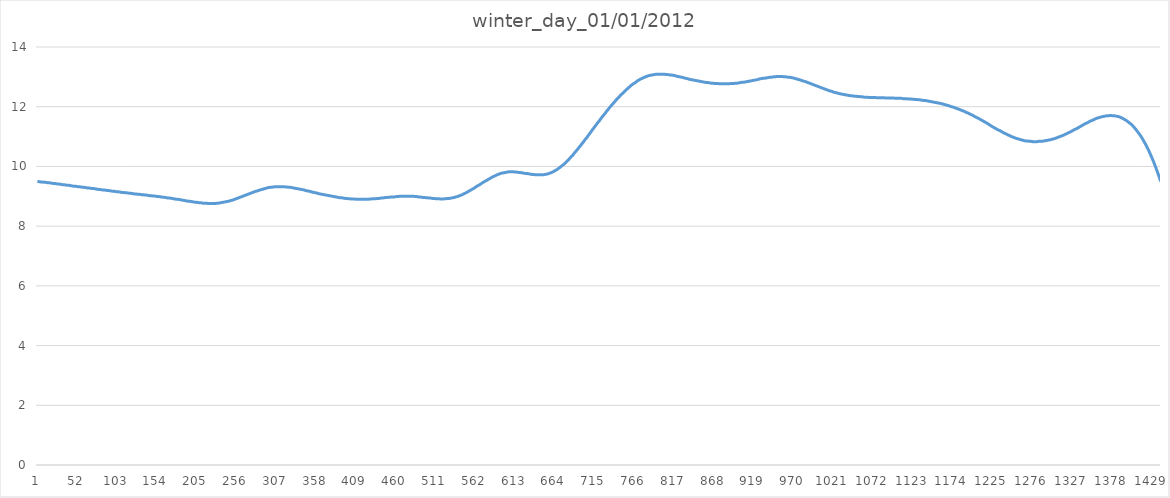
| Category | winter_day_01/01/2012 |
|---|---|
| 0 | 9.5 |
| 1 | 9.49 |
| 2 | 9.49 |
| 3 | 9.49 |
| 4 | 9.48 |
| 5 | 9.48 |
| 6 | 9.48 |
| 7 | 9.48 |
| 8 | 9.47 |
| 9 | 9.47 |
| 10 | 9.47 |
| 11 | 9.46 |
| 12 | 9.46 |
| 13 | 9.46 |
| 14 | 9.45 |
| 15 | 9.45 |
| 16 | 9.45 |
| 17 | 9.44 |
| 18 | 9.44 |
| 19 | 9.44 |
| 20 | 9.43 |
| 21 | 9.43 |
| 22 | 9.43 |
| 23 | 9.42 |
| 24 | 9.42 |
| 25 | 9.42 |
| 26 | 9.41 |
| 27 | 9.41 |
| 28 | 9.41 |
| 29 | 9.4 |
| 30 | 9.4 |
| 31 | 9.4 |
| 32 | 9.39 |
| 33 | 9.39 |
| 34 | 9.39 |
| 35 | 9.38 |
| 36 | 9.38 |
| 37 | 9.38 |
| 38 | 9.37 |
| 39 | 9.37 |
| 40 | 9.37 |
| 41 | 9.36 |
| 42 | 9.36 |
| 43 | 9.36 |
| 44 | 9.35 |
| 45 | 9.35 |
| 46 | 9.34 |
| 47 | 9.34 |
| 48 | 9.34 |
| 49 | 9.33 |
| 50 | 9.33 |
| 51 | 9.33 |
| 52 | 9.32 |
| 53 | 9.32 |
| 54 | 9.32 |
| 55 | 9.31 |
| 56 | 9.31 |
| 57 | 9.31 |
| 58 | 9.3 |
| 59 | 9.3 |
| 60 | 9.3 |
| 61 | 9.29 |
| 62 | 9.29 |
| 63 | 9.29 |
| 64 | 9.28 |
| 65 | 9.28 |
| 66 | 9.28 |
| 67 | 9.27 |
| 68 | 9.27 |
| 69 | 9.27 |
| 70 | 9.26 |
| 71 | 9.26 |
| 72 | 9.26 |
| 73 | 9.25 |
| 74 | 9.25 |
| 75 | 9.24 |
| 76 | 9.24 |
| 77 | 9.24 |
| 78 | 9.23 |
| 79 | 9.23 |
| 80 | 9.23 |
| 81 | 9.22 |
| 82 | 9.22 |
| 83 | 9.22 |
| 84 | 9.21 |
| 85 | 9.21 |
| 86 | 9.21 |
| 87 | 9.2 |
| 88 | 9.2 |
| 89 | 9.2 |
| 90 | 9.19 |
| 91 | 9.19 |
| 92 | 9.19 |
| 93 | 9.18 |
| 94 | 9.18 |
| 95 | 9.18 |
| 96 | 9.17 |
| 97 | 9.17 |
| 98 | 9.17 |
| 99 | 9.16 |
| 100 | 9.16 |
| 101 | 9.16 |
| 102 | 9.15 |
| 103 | 9.15 |
| 104 | 9.15 |
| 105 | 9.14 |
| 106 | 9.14 |
| 107 | 9.14 |
| 108 | 9.13 |
| 109 | 9.13 |
| 110 | 9.13 |
| 111 | 9.12 |
| 112 | 9.12 |
| 113 | 9.12 |
| 114 | 9.12 |
| 115 | 9.11 |
| 116 | 9.11 |
| 117 | 9.11 |
| 118 | 9.1 |
| 119 | 9.1 |
| 120 | 9.1 |
| 121 | 9.09 |
| 122 | 9.09 |
| 123 | 9.09 |
| 124 | 9.08 |
| 125 | 9.08 |
| 126 | 9.08 |
| 127 | 9.08 |
| 128 | 9.07 |
| 129 | 9.07 |
| 130 | 9.07 |
| 131 | 9.06 |
| 132 | 9.06 |
| 133 | 9.06 |
| 134 | 9.05 |
| 135 | 9.05 |
| 136 | 9.05 |
| 137 | 9.05 |
| 138 | 9.04 |
| 139 | 9.04 |
| 140 | 9.04 |
| 141 | 9.03 |
| 142 | 9.03 |
| 143 | 9.03 |
| 144 | 9.02 |
| 145 | 9.02 |
| 146 | 9.02 |
| 147 | 9.02 |
| 148 | 9.01 |
| 149 | 9.01 |
| 150 | 9.01 |
| 151 | 9 |
| 152 | 9 |
| 153 | 9 |
| 154 | 8.99 |
| 155 | 8.99 |
| 156 | 8.99 |
| 157 | 8.98 |
| 158 | 8.98 |
| 159 | 8.98 |
| 160 | 8.97 |
| 161 | 8.97 |
| 162 | 8.97 |
| 163 | 8.96 |
| 164 | 8.96 |
| 165 | 8.95 |
| 166 | 8.95 |
| 167 | 8.95 |
| 168 | 8.94 |
| 169 | 8.94 |
| 170 | 8.94 |
| 171 | 8.93 |
| 172 | 8.93 |
| 173 | 8.92 |
| 174 | 8.92 |
| 175 | 8.92 |
| 176 | 8.91 |
| 177 | 8.91 |
| 178 | 8.9 |
| 179 | 8.9 |
| 180 | 8.9 |
| 181 | 8.89 |
| 182 | 8.89 |
| 183 | 8.88 |
| 184 | 8.88 |
| 185 | 8.87 |
| 186 | 8.87 |
| 187 | 8.86 |
| 188 | 8.86 |
| 189 | 8.86 |
| 190 | 8.85 |
| 191 | 8.85 |
| 192 | 8.84 |
| 193 | 8.84 |
| 194 | 8.83 |
| 195 | 8.83 |
| 196 | 8.83 |
| 197 | 8.82 |
| 198 | 8.82 |
| 199 | 8.81 |
| 200 | 8.81 |
| 201 | 8.81 |
| 202 | 8.8 |
| 203 | 8.8 |
| 204 | 8.8 |
| 205 | 8.79 |
| 206 | 8.79 |
| 207 | 8.79 |
| 208 | 8.78 |
| 209 | 8.78 |
| 210 | 8.78 |
| 211 | 8.78 |
| 212 | 8.77 |
| 213 | 8.77 |
| 214 | 8.77 |
| 215 | 8.77 |
| 216 | 8.77 |
| 217 | 8.76 |
| 218 | 8.76 |
| 219 | 8.76 |
| 220 | 8.76 |
| 221 | 8.76 |
| 222 | 8.76 |
| 223 | 8.76 |
| 224 | 8.76 |
| 225 | 8.76 |
| 226 | 8.76 |
| 227 | 8.76 |
| 228 | 8.76 |
| 229 | 8.77 |
| 230 | 8.77 |
| 231 | 8.77 |
| 232 | 8.77 |
| 233 | 8.78 |
| 234 | 8.78 |
| 235 | 8.78 |
| 236 | 8.79 |
| 237 | 8.79 |
| 238 | 8.8 |
| 239 | 8.8 |
| 240 | 8.81 |
| 241 | 8.81 |
| 242 | 8.82 |
| 243 | 8.82 |
| 244 | 8.83 |
| 245 | 8.84 |
| 246 | 8.84 |
| 247 | 8.85 |
| 248 | 8.86 |
| 249 | 8.87 |
| 250 | 8.87 |
| 251 | 8.88 |
| 252 | 8.89 |
| 253 | 8.9 |
| 254 | 8.91 |
| 255 | 8.92 |
| 256 | 8.93 |
| 257 | 8.94 |
| 258 | 8.95 |
| 259 | 8.96 |
| 260 | 8.97 |
| 261 | 8.98 |
| 262 | 8.99 |
| 263 | 9 |
| 264 | 9.01 |
| 265 | 9.02 |
| 266 | 9.03 |
| 267 | 9.04 |
| 268 | 9.05 |
| 269 | 9.06 |
| 270 | 9.07 |
| 271 | 9.08 |
| 272 | 9.09 |
| 273 | 9.1 |
| 274 | 9.11 |
| 275 | 9.12 |
| 276 | 9.13 |
| 277 | 9.14 |
| 278 | 9.15 |
| 279 | 9.16 |
| 280 | 9.17 |
| 281 | 9.18 |
| 282 | 9.18 |
| 283 | 9.19 |
| 284 | 9.2 |
| 285 | 9.21 |
| 286 | 9.22 |
| 287 | 9.23 |
| 288 | 9.23 |
| 289 | 9.24 |
| 290 | 9.25 |
| 291 | 9.26 |
| 292 | 9.26 |
| 293 | 9.27 |
| 294 | 9.28 |
| 295 | 9.28 |
| 296 | 9.29 |
| 297 | 9.29 |
| 298 | 9.3 |
| 299 | 9.3 |
| 300 | 9.3 |
| 301 | 9.31 |
| 302 | 9.31 |
| 303 | 9.31 |
| 304 | 9.32 |
| 305 | 9.32 |
| 306 | 9.32 |
| 307 | 9.32 |
| 308 | 9.32 |
| 309 | 9.32 |
| 310 | 9.32 |
| 311 | 9.32 |
| 312 | 9.32 |
| 313 | 9.32 |
| 314 | 9.32 |
| 315 | 9.32 |
| 316 | 9.32 |
| 317 | 9.32 |
| 318 | 9.31 |
| 319 | 9.31 |
| 320 | 9.31 |
| 321 | 9.31 |
| 322 | 9.3 |
| 323 | 9.3 |
| 324 | 9.3 |
| 325 | 9.29 |
| 326 | 9.29 |
| 327 | 9.28 |
| 328 | 9.28 |
| 329 | 9.28 |
| 330 | 9.27 |
| 331 | 9.27 |
| 332 | 9.26 |
| 333 | 9.26 |
| 334 | 9.25 |
| 335 | 9.25 |
| 336 | 9.24 |
| 337 | 9.24 |
| 338 | 9.23 |
| 339 | 9.22 |
| 340 | 9.22 |
| 341 | 9.21 |
| 342 | 9.21 |
| 343 | 9.2 |
| 344 | 9.19 |
| 345 | 9.19 |
| 346 | 9.18 |
| 347 | 9.18 |
| 348 | 9.17 |
| 349 | 9.16 |
| 350 | 9.16 |
| 351 | 9.15 |
| 352 | 9.14 |
| 353 | 9.14 |
| 354 | 9.13 |
| 355 | 9.12 |
| 356 | 9.12 |
| 357 | 9.11 |
| 358 | 9.11 |
| 359 | 9.1 |
| 360 | 9.09 |
| 361 | 9.09 |
| 362 | 9.08 |
| 363 | 9.08 |
| 364 | 9.07 |
| 365 | 9.06 |
| 366 | 9.06 |
| 367 | 9.05 |
| 368 | 9.05 |
| 369 | 9.04 |
| 370 | 9.04 |
| 371 | 9.03 |
| 372 | 9.03 |
| 373 | 9.02 |
| 374 | 9.02 |
| 375 | 9.01 |
| 376 | 9.01 |
| 377 | 9 |
| 378 | 9 |
| 379 | 8.99 |
| 380 | 8.99 |
| 381 | 8.98 |
| 382 | 8.98 |
| 383 | 8.97 |
| 384 | 8.97 |
| 385 | 8.96 |
| 386 | 8.96 |
| 387 | 8.96 |
| 388 | 8.95 |
| 389 | 8.95 |
| 390 | 8.95 |
| 391 | 8.94 |
| 392 | 8.94 |
| 393 | 8.94 |
| 394 | 8.93 |
| 395 | 8.93 |
| 396 | 8.93 |
| 397 | 8.92 |
| 398 | 8.92 |
| 399 | 8.92 |
| 400 | 8.92 |
| 401 | 8.91 |
| 402 | 8.91 |
| 403 | 8.91 |
| 404 | 8.91 |
| 405 | 8.91 |
| 406 | 8.91 |
| 407 | 8.9 |
| 408 | 8.9 |
| 409 | 8.9 |
| 410 | 8.9 |
| 411 | 8.9 |
| 412 | 8.9 |
| 413 | 8.9 |
| 414 | 8.9 |
| 415 | 8.9 |
| 416 | 8.9 |
| 417 | 8.9 |
| 418 | 8.9 |
| 419 | 8.9 |
| 420 | 8.9 |
| 421 | 8.9 |
| 422 | 8.9 |
| 423 | 8.9 |
| 424 | 8.9 |
| 425 | 8.91 |
| 426 | 8.91 |
| 427 | 8.91 |
| 428 | 8.91 |
| 429 | 8.91 |
| 430 | 8.92 |
| 431 | 8.92 |
| 432 | 8.92 |
| 433 | 8.92 |
| 434 | 8.92 |
| 435 | 8.93 |
| 436 | 8.93 |
| 437 | 8.93 |
| 438 | 8.93 |
| 439 | 8.94 |
| 440 | 8.94 |
| 441 | 8.94 |
| 442 | 8.94 |
| 443 | 8.95 |
| 444 | 8.95 |
| 445 | 8.95 |
| 446 | 8.96 |
| 447 | 8.96 |
| 448 | 8.96 |
| 449 | 8.96 |
| 450 | 8.97 |
| 451 | 8.97 |
| 452 | 8.97 |
| 453 | 8.97 |
| 454 | 8.98 |
| 455 | 8.98 |
| 456 | 8.98 |
| 457 | 8.98 |
| 458 | 8.98 |
| 459 | 8.99 |
| 460 | 8.99 |
| 461 | 8.99 |
| 462 | 8.99 |
| 463 | 8.99 |
| 464 | 9 |
| 465 | 9 |
| 466 | 9 |
| 467 | 9 |
| 468 | 9 |
| 469 | 9 |
| 470 | 9 |
| 471 | 9 |
| 472 | 9 |
| 473 | 9 |
| 474 | 9 |
| 475 | 9 |
| 476 | 9 |
| 477 | 9 |
| 478 | 9 |
| 479 | 9 |
| 480 | 9 |
| 481 | 9 |
| 482 | 9 |
| 483 | 8.99 |
| 484 | 8.99 |
| 485 | 8.99 |
| 486 | 8.99 |
| 487 | 8.98 |
| 488 | 8.98 |
| 489 | 8.98 |
| 490 | 8.98 |
| 491 | 8.97 |
| 492 | 8.97 |
| 493 | 8.97 |
| 494 | 8.96 |
| 495 | 8.96 |
| 496 | 8.96 |
| 497 | 8.96 |
| 498 | 8.95 |
| 499 | 8.95 |
| 500 | 8.95 |
| 501 | 8.94 |
| 502 | 8.94 |
| 503 | 8.94 |
| 504 | 8.94 |
| 505 | 8.93 |
| 506 | 8.93 |
| 507 | 8.93 |
| 508 | 8.93 |
| 509 | 8.92 |
| 510 | 8.92 |
| 511 | 8.92 |
| 512 | 8.92 |
| 513 | 8.92 |
| 514 | 8.92 |
| 515 | 8.91 |
| 516 | 8.91 |
| 517 | 8.91 |
| 518 | 8.91 |
| 519 | 8.91 |
| 520 | 8.91 |
| 521 | 8.92 |
| 522 | 8.92 |
| 523 | 8.92 |
| 524 | 8.92 |
| 525 | 8.92 |
| 526 | 8.93 |
| 527 | 8.93 |
| 528 | 8.93 |
| 529 | 8.94 |
| 530 | 8.94 |
| 531 | 8.94 |
| 532 | 8.95 |
| 533 | 8.96 |
| 534 | 8.96 |
| 535 | 8.97 |
| 536 | 8.98 |
| 537 | 8.98 |
| 538 | 8.99 |
| 539 | 9 |
| 540 | 9.01 |
| 541 | 9.02 |
| 542 | 9.03 |
| 543 | 9.04 |
| 544 | 9.05 |
| 545 | 9.06 |
| 546 | 9.08 |
| 547 | 9.09 |
| 548 | 9.1 |
| 549 | 9.12 |
| 550 | 9.13 |
| 551 | 9.14 |
| 552 | 9.16 |
| 553 | 9.17 |
| 554 | 9.19 |
| 555 | 9.2 |
| 556 | 9.22 |
| 557 | 9.23 |
| 558 | 9.25 |
| 559 | 9.27 |
| 560 | 9.28 |
| 561 | 9.3 |
| 562 | 9.32 |
| 563 | 9.33 |
| 564 | 9.35 |
| 565 | 9.36 |
| 566 | 9.38 |
| 567 | 9.4 |
| 568 | 9.41 |
| 569 | 9.43 |
| 570 | 9.45 |
| 571 | 9.46 |
| 572 | 9.48 |
| 573 | 9.5 |
| 574 | 9.51 |
| 575 | 9.53 |
| 576 | 9.54 |
| 577 | 9.56 |
| 578 | 9.57 |
| 579 | 9.59 |
| 580 | 9.6 |
| 581 | 9.62 |
| 582 | 9.63 |
| 583 | 9.65 |
| 584 | 9.66 |
| 585 | 9.67 |
| 586 | 9.68 |
| 587 | 9.7 |
| 588 | 9.71 |
| 589 | 9.72 |
| 590 | 9.73 |
| 591 | 9.74 |
| 592 | 9.75 |
| 593 | 9.76 |
| 594 | 9.77 |
| 595 | 9.78 |
| 596 | 9.78 |
| 597 | 9.79 |
| 598 | 9.79 |
| 599 | 9.8 |
| 600 | 9.8 |
| 601 | 9.81 |
| 602 | 9.81 |
| 603 | 9.81 |
| 604 | 9.82 |
| 605 | 9.82 |
| 606 | 9.82 |
| 607 | 9.82 |
| 608 | 9.82 |
| 609 | 9.82 |
| 610 | 9.82 |
| 611 | 9.82 |
| 612 | 9.81 |
| 613 | 9.81 |
| 614 | 9.81 |
| 615 | 9.81 |
| 616 | 9.8 |
| 617 | 9.8 |
| 618 | 9.8 |
| 619 | 9.79 |
| 620 | 9.79 |
| 621 | 9.78 |
| 622 | 9.78 |
| 623 | 9.78 |
| 624 | 9.77 |
| 625 | 9.77 |
| 626 | 9.76 |
| 627 | 9.76 |
| 628 | 9.76 |
| 629 | 9.75 |
| 630 | 9.75 |
| 631 | 9.74 |
| 632 | 9.74 |
| 633 | 9.74 |
| 634 | 9.73 |
| 635 | 9.73 |
| 636 | 9.73 |
| 637 | 9.72 |
| 638 | 9.72 |
| 639 | 9.72 |
| 640 | 9.72 |
| 641 | 9.72 |
| 642 | 9.72 |
| 643 | 9.72 |
| 644 | 9.72 |
| 645 | 9.72 |
| 646 | 9.72 |
| 647 | 9.72 |
| 648 | 9.72 |
| 649 | 9.73 |
| 650 | 9.73 |
| 651 | 9.74 |
| 652 | 9.74 |
| 653 | 9.75 |
| 654 | 9.75 |
| 655 | 9.76 |
| 656 | 9.77 |
| 657 | 9.78 |
| 658 | 9.79 |
| 659 | 9.8 |
| 660 | 9.81 |
| 661 | 9.82 |
| 662 | 9.84 |
| 663 | 9.85 |
| 664 | 9.87 |
| 665 | 9.88 |
| 666 | 9.9 |
| 667 | 9.92 |
| 668 | 9.94 |
| 669 | 9.96 |
| 670 | 9.98 |
| 671 | 10 |
| 672 | 10.02 |
| 673 | 10.04 |
| 674 | 10.06 |
| 675 | 10.09 |
| 676 | 10.11 |
| 677 | 10.14 |
| 678 | 10.16 |
| 679 | 10.19 |
| 680 | 10.21 |
| 681 | 10.24 |
| 682 | 10.27 |
| 683 | 10.3 |
| 684 | 10.33 |
| 685 | 10.36 |
| 686 | 10.38 |
| 687 | 10.41 |
| 688 | 10.45 |
| 689 | 10.48 |
| 690 | 10.51 |
| 691 | 10.54 |
| 692 | 10.57 |
| 693 | 10.6 |
| 694 | 10.64 |
| 695 | 10.67 |
| 696 | 10.7 |
| 697 | 10.74 |
| 698 | 10.77 |
| 699 | 10.8 |
| 700 | 10.84 |
| 701 | 10.87 |
| 702 | 10.91 |
| 703 | 10.94 |
| 704 | 10.97 |
| 705 | 11.01 |
| 706 | 11.04 |
| 707 | 11.08 |
| 708 | 11.11 |
| 709 | 11.15 |
| 710 | 11.19 |
| 711 | 11.22 |
| 712 | 11.26 |
| 713 | 11.29 |
| 714 | 11.33 |
| 715 | 11.36 |
| 716 | 11.4 |
| 717 | 11.43 |
| 718 | 11.47 |
| 719 | 11.5 |
| 720 | 11.53 |
| 721 | 11.57 |
| 722 | 11.6 |
| 723 | 11.64 |
| 724 | 11.67 |
| 725 | 11.7 |
| 726 | 11.74 |
| 727 | 11.77 |
| 728 | 11.8 |
| 729 | 11.84 |
| 730 | 11.87 |
| 731 | 11.9 |
| 732 | 11.93 |
| 733 | 11.97 |
| 734 | 12 |
| 735 | 12.03 |
| 736 | 12.06 |
| 737 | 12.09 |
| 738 | 12.12 |
| 739 | 12.15 |
| 740 | 12.18 |
| 741 | 12.21 |
| 742 | 12.24 |
| 743 | 12.27 |
| 744 | 12.3 |
| 745 | 12.32 |
| 746 | 12.35 |
| 747 | 12.38 |
| 748 | 12.41 |
| 749 | 12.43 |
| 750 | 12.46 |
| 751 | 12.48 |
| 752 | 12.51 |
| 753 | 12.53 |
| 754 | 12.56 |
| 755 | 12.58 |
| 756 | 12.61 |
| 757 | 12.63 |
| 758 | 12.65 |
| 759 | 12.67 |
| 760 | 12.69 |
| 761 | 12.72 |
| 762 | 12.74 |
| 763 | 12.76 |
| 764 | 12.78 |
| 765 | 12.79 |
| 766 | 12.81 |
| 767 | 12.83 |
| 768 | 12.85 |
| 769 | 12.87 |
| 770 | 12.88 |
| 771 | 12.9 |
| 772 | 12.91 |
| 773 | 12.93 |
| 774 | 12.94 |
| 775 | 12.95 |
| 776 | 12.97 |
| 777 | 12.98 |
| 778 | 12.99 |
| 779 | 13 |
| 780 | 13.01 |
| 781 | 13.02 |
| 782 | 13.03 |
| 783 | 13.04 |
| 784 | 13.04 |
| 785 | 13.05 |
| 786 | 13.06 |
| 787 | 13.06 |
| 788 | 13.07 |
| 789 | 13.07 |
| 790 | 13.08 |
| 791 | 13.08 |
| 792 | 13.08 |
| 793 | 13.09 |
| 794 | 13.09 |
| 795 | 13.09 |
| 796 | 13.09 |
| 797 | 13.09 |
| 798 | 13.09 |
| 799 | 13.09 |
| 800 | 13.09 |
| 801 | 13.09 |
| 802 | 13.09 |
| 803 | 13.09 |
| 804 | 13.09 |
| 805 | 13.08 |
| 806 | 13.08 |
| 807 | 13.08 |
| 808 | 13.08 |
| 809 | 13.07 |
| 810 | 13.07 |
| 811 | 13.06 |
| 812 | 13.06 |
| 813 | 13.06 |
| 814 | 13.05 |
| 815 | 13.05 |
| 816 | 13.04 |
| 817 | 13.04 |
| 818 | 13.03 |
| 819 | 13.02 |
| 820 | 13.02 |
| 821 | 13.01 |
| 822 | 13.01 |
| 823 | 13 |
| 824 | 12.99 |
| 825 | 12.99 |
| 826 | 12.98 |
| 827 | 12.98 |
| 828 | 12.97 |
| 829 | 12.96 |
| 830 | 12.96 |
| 831 | 12.95 |
| 832 | 12.94 |
| 833 | 12.94 |
| 834 | 12.93 |
| 835 | 12.92 |
| 836 | 12.92 |
| 837 | 12.91 |
| 838 | 12.91 |
| 839 | 12.9 |
| 840 | 12.89 |
| 841 | 12.89 |
| 842 | 12.88 |
| 843 | 12.88 |
| 844 | 12.87 |
| 845 | 12.87 |
| 846 | 12.86 |
| 847 | 12.86 |
| 848 | 12.85 |
| 849 | 12.85 |
| 850 | 12.84 |
| 851 | 12.84 |
| 852 | 12.83 |
| 853 | 12.83 |
| 854 | 12.82 |
| 855 | 12.82 |
| 856 | 12.82 |
| 857 | 12.81 |
| 858 | 12.81 |
| 859 | 12.81 |
| 860 | 12.8 |
| 861 | 12.8 |
| 862 | 12.8 |
| 863 | 12.79 |
| 864 | 12.79 |
| 865 | 12.79 |
| 866 | 12.79 |
| 867 | 12.78 |
| 868 | 12.78 |
| 869 | 12.78 |
| 870 | 12.78 |
| 871 | 12.78 |
| 872 | 12.78 |
| 873 | 12.77 |
| 874 | 12.77 |
| 875 | 12.77 |
| 876 | 12.77 |
| 877 | 12.77 |
| 878 | 12.77 |
| 879 | 12.77 |
| 880 | 12.77 |
| 881 | 12.77 |
| 882 | 12.77 |
| 883 | 12.77 |
| 884 | 12.77 |
| 885 | 12.77 |
| 886 | 12.77 |
| 887 | 12.77 |
| 888 | 12.77 |
| 889 | 12.78 |
| 890 | 12.78 |
| 891 | 12.78 |
| 892 | 12.78 |
| 893 | 12.78 |
| 894 | 12.79 |
| 895 | 12.79 |
| 896 | 12.79 |
| 897 | 12.79 |
| 898 | 12.8 |
| 899 | 12.8 |
| 900 | 12.8 |
| 901 | 12.81 |
| 902 | 12.81 |
| 903 | 12.82 |
| 904 | 12.82 |
| 905 | 12.82 |
| 906 | 12.83 |
| 907 | 12.83 |
| 908 | 12.84 |
| 909 | 12.84 |
| 910 | 12.85 |
| 911 | 12.85 |
| 912 | 12.86 |
| 913 | 12.86 |
| 914 | 12.87 |
| 915 | 12.87 |
| 916 | 12.88 |
| 917 | 12.88 |
| 918 | 12.89 |
| 919 | 12.89 |
| 920 | 12.9 |
| 921 | 12.9 |
| 922 | 12.91 |
| 923 | 12.91 |
| 924 | 12.92 |
| 925 | 12.93 |
| 926 | 12.93 |
| 927 | 12.94 |
| 928 | 12.94 |
| 929 | 12.95 |
| 930 | 12.95 |
| 931 | 12.95 |
| 932 | 12.96 |
| 933 | 12.96 |
| 934 | 12.97 |
| 935 | 12.97 |
| 936 | 12.98 |
| 937 | 12.98 |
| 938 | 12.98 |
| 939 | 12.99 |
| 940 | 12.99 |
| 941 | 12.99 |
| 942 | 13 |
| 943 | 13 |
| 944 | 13 |
| 945 | 13 |
| 946 | 13 |
| 947 | 13.01 |
| 948 | 13.01 |
| 949 | 13.01 |
| 950 | 13.01 |
| 951 | 13.01 |
| 952 | 13.01 |
| 953 | 13.01 |
| 954 | 13.01 |
| 955 | 13.01 |
| 956 | 13.01 |
| 957 | 13 |
| 958 | 13 |
| 959 | 13 |
| 960 | 13 |
| 961 | 12.99 |
| 962 | 12.99 |
| 963 | 12.99 |
| 964 | 12.98 |
| 965 | 12.98 |
| 966 | 12.97 |
| 967 | 12.97 |
| 968 | 12.96 |
| 969 | 12.96 |
| 970 | 12.95 |
| 971 | 12.94 |
| 972 | 12.94 |
| 973 | 12.93 |
| 974 | 12.92 |
| 975 | 12.91 |
| 976 | 12.91 |
| 977 | 12.9 |
| 978 | 12.89 |
| 979 | 12.88 |
| 980 | 12.87 |
| 981 | 12.86 |
| 982 | 12.86 |
| 983 | 12.85 |
| 984 | 12.84 |
| 985 | 12.83 |
| 986 | 12.82 |
| 987 | 12.81 |
| 988 | 12.8 |
| 989 | 12.79 |
| 990 | 12.78 |
| 991 | 12.77 |
| 992 | 12.76 |
| 993 | 12.75 |
| 994 | 12.74 |
| 995 | 12.73 |
| 996 | 12.72 |
| 997 | 12.71 |
| 998 | 12.7 |
| 999 | 12.69 |
| 1000 | 12.68 |
| 1001 | 12.67 |
| 1002 | 12.66 |
| 1003 | 12.65 |
| 1004 | 12.64 |
| 1005 | 12.63 |
| 1006 | 12.62 |
| 1007 | 12.61 |
| 1008 | 12.6 |
| 1009 | 12.59 |
| 1010 | 12.58 |
| 1011 | 12.57 |
| 1012 | 12.56 |
| 1013 | 12.55 |
| 1014 | 12.54 |
| 1015 | 12.53 |
| 1016 | 12.52 |
| 1017 | 12.52 |
| 1018 | 12.51 |
| 1019 | 12.5 |
| 1020 | 12.49 |
| 1021 | 12.48 |
| 1022 | 12.48 |
| 1023 | 12.47 |
| 1024 | 12.46 |
| 1025 | 12.46 |
| 1026 | 12.45 |
| 1027 | 12.44 |
| 1028 | 12.44 |
| 1029 | 12.43 |
| 1030 | 12.43 |
| 1031 | 12.42 |
| 1032 | 12.41 |
| 1033 | 12.41 |
| 1034 | 12.4 |
| 1035 | 12.4 |
| 1036 | 12.39 |
| 1037 | 12.39 |
| 1038 | 12.39 |
| 1039 | 12.38 |
| 1040 | 12.38 |
| 1041 | 12.37 |
| 1042 | 12.37 |
| 1043 | 12.37 |
| 1044 | 12.36 |
| 1045 | 12.36 |
| 1046 | 12.36 |
| 1047 | 12.35 |
| 1048 | 12.35 |
| 1049 | 12.35 |
| 1050 | 12.34 |
| 1051 | 12.34 |
| 1052 | 12.34 |
| 1053 | 12.34 |
| 1054 | 12.33 |
| 1055 | 12.33 |
| 1056 | 12.33 |
| 1057 | 12.33 |
| 1058 | 12.33 |
| 1059 | 12.32 |
| 1060 | 12.32 |
| 1061 | 12.32 |
| 1062 | 12.32 |
| 1063 | 12.32 |
| 1064 | 12.32 |
| 1065 | 12.31 |
| 1066 | 12.31 |
| 1067 | 12.31 |
| 1068 | 12.31 |
| 1069 | 12.31 |
| 1070 | 12.31 |
| 1071 | 12.31 |
| 1072 | 12.31 |
| 1073 | 12.31 |
| 1074 | 12.3 |
| 1075 | 12.3 |
| 1076 | 12.3 |
| 1077 | 12.3 |
| 1078 | 12.3 |
| 1079 | 12.3 |
| 1080 | 12.3 |
| 1081 | 12.3 |
| 1082 | 12.3 |
| 1083 | 12.3 |
| 1084 | 12.3 |
| 1085 | 12.3 |
| 1086 | 12.29 |
| 1087 | 12.29 |
| 1088 | 12.29 |
| 1089 | 12.29 |
| 1090 | 12.29 |
| 1091 | 12.29 |
| 1092 | 12.29 |
| 1093 | 12.29 |
| 1094 | 12.29 |
| 1095 | 12.29 |
| 1096 | 12.29 |
| 1097 | 12.29 |
| 1098 | 12.29 |
| 1099 | 12.28 |
| 1100 | 12.28 |
| 1101 | 12.28 |
| 1102 | 12.28 |
| 1103 | 12.28 |
| 1104 | 12.28 |
| 1105 | 12.28 |
| 1106 | 12.28 |
| 1107 | 12.28 |
| 1108 | 12.27 |
| 1109 | 12.27 |
| 1110 | 12.27 |
| 1111 | 12.27 |
| 1112 | 12.27 |
| 1113 | 12.27 |
| 1114 | 12.27 |
| 1115 | 12.26 |
| 1116 | 12.26 |
| 1117 | 12.26 |
| 1118 | 12.26 |
| 1119 | 12.26 |
| 1120 | 12.26 |
| 1121 | 12.25 |
| 1122 | 12.25 |
| 1123 | 12.25 |
| 1124 | 12.25 |
| 1125 | 12.24 |
| 1126 | 12.24 |
| 1127 | 12.24 |
| 1128 | 12.24 |
| 1129 | 12.23 |
| 1130 | 12.23 |
| 1131 | 12.23 |
| 1132 | 12.22 |
| 1133 | 12.22 |
| 1134 | 12.22 |
| 1135 | 12.21 |
| 1136 | 12.21 |
| 1137 | 12.21 |
| 1138 | 12.2 |
| 1139 | 12.2 |
| 1140 | 12.2 |
| 1141 | 12.19 |
| 1142 | 12.19 |
| 1143 | 12.18 |
| 1144 | 12.18 |
| 1145 | 12.17 |
| 1146 | 12.17 |
| 1147 | 12.16 |
| 1148 | 12.16 |
| 1149 | 12.15 |
| 1150 | 12.15 |
| 1151 | 12.14 |
| 1152 | 12.14 |
| 1153 | 12.13 |
| 1154 | 12.13 |
| 1155 | 12.12 |
| 1156 | 12.11 |
| 1157 | 12.11 |
| 1158 | 12.1 |
| 1159 | 12.1 |
| 1160 | 12.09 |
| 1161 | 12.08 |
| 1162 | 12.07 |
| 1163 | 12.07 |
| 1164 | 12.06 |
| 1165 | 12.05 |
| 1166 | 12.05 |
| 1167 | 12.04 |
| 1168 | 12.03 |
| 1169 | 12.02 |
| 1170 | 12.01 |
| 1171 | 12 |
| 1172 | 12 |
| 1173 | 11.99 |
| 1174 | 11.98 |
| 1175 | 11.97 |
| 1176 | 11.96 |
| 1177 | 11.95 |
| 1178 | 11.94 |
| 1179 | 11.93 |
| 1180 | 11.92 |
| 1181 | 11.91 |
| 1182 | 11.9 |
| 1183 | 11.89 |
| 1184 | 11.88 |
| 1185 | 11.87 |
| 1186 | 11.86 |
| 1187 | 11.85 |
| 1188 | 11.84 |
| 1189 | 11.82 |
| 1190 | 11.81 |
| 1191 | 11.8 |
| 1192 | 11.79 |
| 1193 | 11.78 |
| 1194 | 11.76 |
| 1195 | 11.75 |
| 1196 | 11.74 |
| 1197 | 11.73 |
| 1198 | 11.71 |
| 1199 | 11.7 |
| 1200 | 11.69 |
| 1201 | 11.67 |
| 1202 | 11.66 |
| 1203 | 11.64 |
| 1204 | 11.63 |
| 1205 | 11.62 |
| 1206 | 11.6 |
| 1207 | 11.59 |
| 1208 | 11.57 |
| 1209 | 11.56 |
| 1210 | 11.54 |
| 1211 | 11.53 |
| 1212 | 11.51 |
| 1213 | 11.5 |
| 1214 | 11.48 |
| 1215 | 11.47 |
| 1216 | 11.45 |
| 1217 | 11.44 |
| 1218 | 11.42 |
| 1219 | 11.41 |
| 1220 | 11.39 |
| 1221 | 11.37 |
| 1222 | 11.36 |
| 1223 | 11.34 |
| 1224 | 11.33 |
| 1225 | 11.31 |
| 1226 | 11.3 |
| 1227 | 11.28 |
| 1228 | 11.27 |
| 1229 | 11.25 |
| 1230 | 11.24 |
| 1231 | 11.22 |
| 1232 | 11.21 |
| 1233 | 11.2 |
| 1234 | 11.18 |
| 1235 | 11.17 |
| 1236 | 11.15 |
| 1237 | 11.14 |
| 1238 | 11.13 |
| 1239 | 11.11 |
| 1240 | 11.1 |
| 1241 | 11.09 |
| 1242 | 11.07 |
| 1243 | 11.06 |
| 1244 | 11.05 |
| 1245 | 11.04 |
| 1246 | 11.02 |
| 1247 | 11.01 |
| 1248 | 11 |
| 1249 | 10.99 |
| 1250 | 10.98 |
| 1251 | 10.97 |
| 1252 | 10.96 |
| 1253 | 10.95 |
| 1254 | 10.94 |
| 1255 | 10.93 |
| 1256 | 10.92 |
| 1257 | 10.92 |
| 1258 | 10.91 |
| 1259 | 10.9 |
| 1260 | 10.89 |
| 1261 | 10.89 |
| 1262 | 10.88 |
| 1263 | 10.87 |
| 1264 | 10.87 |
| 1265 | 10.86 |
| 1266 | 10.86 |
| 1267 | 10.85 |
| 1268 | 10.85 |
| 1269 | 10.85 |
| 1270 | 10.84 |
| 1271 | 10.84 |
| 1272 | 10.84 |
| 1273 | 10.84 |
| 1274 | 10.83 |
| 1275 | 10.83 |
| 1276 | 10.83 |
| 1277 | 10.83 |
| 1278 | 10.83 |
| 1279 | 10.83 |
| 1280 | 10.83 |
| 1281 | 10.83 |
| 1282 | 10.83 |
| 1283 | 10.84 |
| 1284 | 10.84 |
| 1285 | 10.84 |
| 1286 | 10.84 |
| 1287 | 10.84 |
| 1288 | 10.85 |
| 1289 | 10.85 |
| 1290 | 10.86 |
| 1291 | 10.86 |
| 1292 | 10.86 |
| 1293 | 10.87 |
| 1294 | 10.87 |
| 1295 | 10.88 |
| 1296 | 10.88 |
| 1297 | 10.89 |
| 1298 | 10.9 |
| 1299 | 10.9 |
| 1300 | 10.91 |
| 1301 | 10.92 |
| 1302 | 10.93 |
| 1303 | 10.93 |
| 1304 | 10.94 |
| 1305 | 10.95 |
| 1306 | 10.96 |
| 1307 | 10.97 |
| 1308 | 10.98 |
| 1309 | 10.99 |
| 1310 | 11 |
| 1311 | 11.01 |
| 1312 | 11.02 |
| 1313 | 11.03 |
| 1314 | 11.04 |
| 1315 | 11.05 |
| 1316 | 11.06 |
| 1317 | 11.08 |
| 1318 | 11.09 |
| 1319 | 11.1 |
| 1320 | 11.11 |
| 1321 | 11.13 |
| 1322 | 11.14 |
| 1323 | 11.15 |
| 1324 | 11.17 |
| 1325 | 11.18 |
| 1326 | 11.19 |
| 1327 | 11.21 |
| 1328 | 11.22 |
| 1329 | 11.24 |
| 1330 | 11.25 |
| 1331 | 11.26 |
| 1332 | 11.28 |
| 1333 | 11.29 |
| 1334 | 11.31 |
| 1335 | 11.32 |
| 1336 | 11.34 |
| 1337 | 11.35 |
| 1338 | 11.37 |
| 1339 | 11.38 |
| 1340 | 11.39 |
| 1341 | 11.41 |
| 1342 | 11.42 |
| 1343 | 11.44 |
| 1344 | 11.45 |
| 1345 | 11.46 |
| 1346 | 11.48 |
| 1347 | 11.49 |
| 1348 | 11.5 |
| 1349 | 11.52 |
| 1350 | 11.53 |
| 1351 | 11.54 |
| 1352 | 11.55 |
| 1353 | 11.56 |
| 1354 | 11.58 |
| 1355 | 11.59 |
| 1356 | 11.6 |
| 1357 | 11.61 |
| 1358 | 11.62 |
| 1359 | 11.63 |
| 1360 | 11.64 |
| 1361 | 11.64 |
| 1362 | 11.65 |
| 1363 | 11.66 |
| 1364 | 11.67 |
| 1365 | 11.67 |
| 1366 | 11.68 |
| 1367 | 11.68 |
| 1368 | 11.69 |
| 1369 | 11.69 |
| 1370 | 11.7 |
| 1371 | 11.7 |
| 1372 | 11.7 |
| 1373 | 11.7 |
| 1374 | 11.71 |
| 1375 | 11.71 |
| 1376 | 11.71 |
| 1377 | 11.7 |
| 1378 | 11.7 |
| 1379 | 11.7 |
| 1380 | 11.7 |
| 1381 | 11.69 |
| 1382 | 11.69 |
| 1383 | 11.68 |
| 1384 | 11.68 |
| 1385 | 11.67 |
| 1386 | 11.66 |
| 1387 | 11.65 |
| 1388 | 11.64 |
| 1389 | 11.63 |
| 1390 | 11.62 |
| 1391 | 11.6 |
| 1392 | 11.59 |
| 1393 | 11.57 |
| 1394 | 11.56 |
| 1395 | 11.54 |
| 1396 | 11.52 |
| 1397 | 11.5 |
| 1398 | 11.48 |
| 1399 | 11.46 |
| 1400 | 11.44 |
| 1401 | 11.42 |
| 1402 | 11.39 |
| 1403 | 11.37 |
| 1404 | 11.34 |
| 1405 | 11.31 |
| 1406 | 11.28 |
| 1407 | 11.25 |
| 1408 | 11.22 |
| 1409 | 11.18 |
| 1410 | 11.15 |
| 1411 | 11.11 |
| 1412 | 11.08 |
| 1413 | 11.04 |
| 1414 | 11 |
| 1415 | 10.96 |
| 1416 | 10.91 |
| 1417 | 10.87 |
| 1418 | 10.82 |
| 1419 | 10.78 |
| 1420 | 10.73 |
| 1421 | 10.68 |
| 1422 | 10.62 |
| 1423 | 10.57 |
| 1424 | 10.52 |
| 1425 | 10.46 |
| 1426 | 10.4 |
| 1427 | 10.34 |
| 1428 | 10.28 |
| 1429 | 10.22 |
| 1430 | 10.16 |
| 1431 | 10.09 |
| 1432 | 10.02 |
| 1433 | 9.95 |
| 1434 | 9.88 |
| 1435 | 9.81 |
| 1436 | 9.73 |
| 1437 | 9.66 |
| 1438 | 9.58 |
| 1439 | 9.5 |